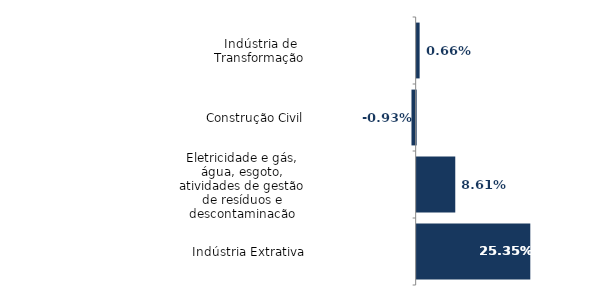
| Category | Series 0 |
|---|---|
| Indústria de Transformação | 0.007 |
| Construção Civil | -0.009 |
| Eletricidade e gás, água, esgoto, atividades de gestão de resíduos e descontaminação | 0.086 |
| Indústria Extrativa | 0.253 |